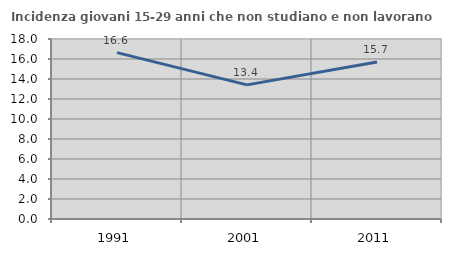
| Category | Incidenza giovani 15-29 anni che non studiano e non lavorano  |
|---|---|
| 1991.0 | 16.64 |
| 2001.0 | 13.413 |
| 2011.0 | 15.702 |